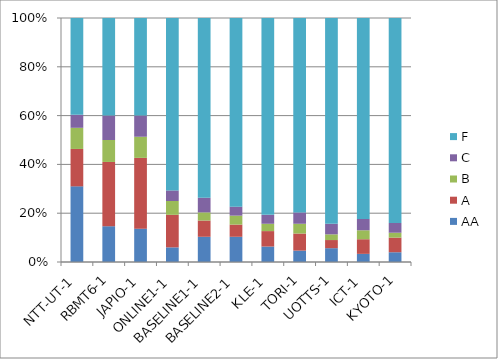
| Category | AA | A | B | C | F |
|---|---|---|---|---|---|
| NTT-UT-1 | 93 | 46 | 26 | 16 | 119 |
| RBMT6-1 | 44 | 79 | 27 | 30 | 120 |
| JAPIO-1 | 41 | 87 | 26 | 26 | 120 |
| ONLINE1-1 | 18 | 40 | 17 | 13 | 212 |
| BASELINE1-1 | 31 | 20 | 10 | 18 | 221 |
| BASELINE2-1 | 31 | 15 | 11 | 11 | 232 |
| KLE-1 | 19 | 19 | 9 | 11 | 242 |
| TORI-1 | 14 | 21 | 12 | 14 | 239 |
| UOTTS-1 | 17 | 10 | 7 | 13 | 253 |
| ICT-1 | 10 | 18 | 11 | 14 | 247 |
| KYOTO-1 | 12 | 18 | 6 | 12 | 252 |